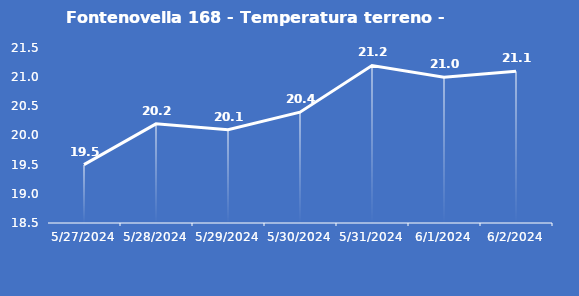
| Category | Fontenovella 168 - Temperatura terreno - Grezzo (°C) |
|---|---|
| 5/27/24 | 19.5 |
| 5/28/24 | 20.2 |
| 5/29/24 | 20.1 |
| 5/30/24 | 20.4 |
| 5/31/24 | 21.2 |
| 6/1/24 | 21 |
| 6/2/24 | 21.1 |